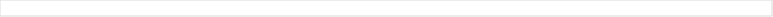
| Category | Fermentation entérique (CH4) | Gestion du fumier (CH4, N2O) | Riziculture (CH4) | Sol agricole (N2O) | Autres (CO2, CH4, N2O) |
|---|---|---|---|---|---|
| Inde | 393.502 | 37.153 | 129.4 | 190.669 | 4.804 |
| Chine | 183.373 | 52.462 | 147.381 | 277.634 | 6.604 |
| Etats-Unis | 178.559 | 81.983 | 15.054 | 344.62 | 8.402 |
| Brésil | 355.083 | 12.716 | 3.11 | 140.269 | 14.535 |
| Union européenne 27 | 164.245 | 55.772 | 2.489 | 151.999 | 11.588 |
| Indonésie | 30.212 | 9.91 | 63.213 | 72.445 | 2.093 |
| Russie | 39.09 | 12.295 | 0.602 | 61.257 | 0.93 |
| Mexique | 53.443 | 18.039 | 0.165 | 28.815 | 1.599 |
| Argentine | 54.002 | 2.204 | 0.604 | 36.811 | 4.978 |
| Viet Nam | 12.779 | 5.979 | 36.916 | 16.46 | 0.605 |
| Australie | 48.209 | 6.433 | 0.032 | 12.21 | 2.87 |
| Turquie | 33.368 | 8.597 | 0.263 | 24.343 | 1.453 |
| Philippines | 8.778 | 3.89 | 43.574 | 8.25 | 0.535 |
| Canada | 24.009 | 7.924 | 0 | 24.445 | 2.68 |
| Colombie | 20.625 | 2.594 | 0.507 | 18.344 | 1.083 |
| Ukraine | 7.876 | 1.997 | 0.078 | 32.176 | 0.35 |
| Royaume-Uni | 21.214 | 6.723 | 0 | 12.25 | 1.947 |
| Nouvelle-Zélande | 28.975 | 1.739 | 0 | 7.763 | 1.141 |
| Kazakhstan | 20.546 | 3.418 | 0.546 | 12.576 | 0.003 |
| Japon | 7.563 | 6.018 | 11.946 | 5.581 | 0.574 |
| Afrique du Sud | 15.353 | 0.889 | 0.009 | 11.139 | 1.802 |
| Corée | 4.471 | 4.936 | 6.297 | 5.472 | 0.015 |
| Chili | 4.971 | 1.498 | 0.149 | 4.697 | 0.475 |
| Suisse | 3.252 | 1.04 | 0 | 1.527 | 0.045 |
| Norvège | 2.24 | 0.48 | 0 | 1.624 | 0.098 |
| Costa Rica | 2.759 | 0.139 | 0.025 | 1.346 | 0.021 |
| Israel | 0.806 | 0.256 | 0 | 1.126 | 0 |
| Islande | 0.297 | 0.074 | 0 | 0.242 | 0.006 |